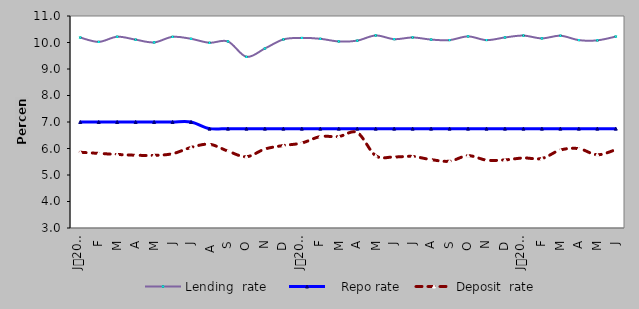
| Category | Lending  rate |    Repo rate | Deposit  rate |
|---|---|---|---|
| 0 | 10.187 | 7 | 5.858 |
| 1900-01-01 | 10.024 | 7 | 5.815 |
| 1900-01-02 | 10.218 | 7 | 5.776 |
| 1900-01-03 | 10.107 | 7 | 5.746 |
| 1900-01-04 | 10.004 | 7 | 5.74 |
| 1900-01-05 | 10.214 | 7 | 5.804 |
| 1900-01-06 | 10.14 | 7 | 6.04 |
| 1900-01-07 | 9.99 | 6.75 | 6.16 |
| 1900-01-08 | 10.04 | 6.75 | 5.9 |
| 1900-01-09 | 9.46 | 6.75 | 5.69 |
| 1900-01-10 | 9.774 | 6.75 | 5.98 |
| 1900-01-11 | 10.117 | 6.75 | 6.113 |
| 1900-01-12 | 10.174 | 6.75 | 6.207 |
| 1900-01-13 | 10.14 | 6.75 | 6.45 |
| 1900-01-14 | 10.04 | 6.75 | 6.45 |
| 1900-01-15 | 10.07 | 6.75 | 6.6 |
| 1900-01-16 | 10.265 | 6.75 | 5.728 |
| 1900-01-17 | 10.125 | 6.75 | 5.682 |
| 1900-01-18 | 10.19 | 6.75 | 5.7 |
| 1900-01-19 | 10.11 | 6.75 | 5.58 |
| 1900-01-20 | 10.09 | 6.75 | 5.52 |
| 1900-01-21 | 10.23 | 6.75 | 5.73 |
| 1900-01-22 | 10.09 | 6.75 | 5.56 |
| 1900-01-23 | 10.19 | 6.75 | 5.57 |
| 1900-01-24 | 10.261 | 6.75 | 5.643 |
| 1900-01-25 | 10.155 | 6.75 | 5.624 |
| 1900-01-26 | 10.257 | 6.75 | 5.943 |
| 1900-01-27 | 10.09 | 6.75 | 5.994 |
| 1900-01-28 | 10.081 | 6.75 | 5.764 |
| 1900-01-29 | 10.224 | 6.75 | 5.956 |